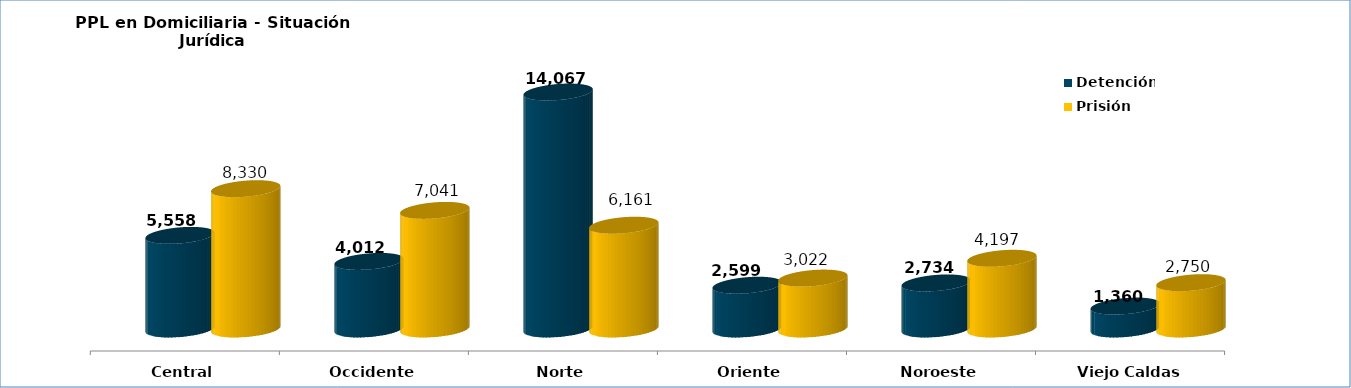
| Category | Detención | Prisión |
|---|---|---|
| Central | 5558 | 8330 |
| Occidente | 4012 | 7041 |
| Norte | 14067 | 6161 |
| Oriente | 2599 | 3022 |
| Noroeste | 2734 | 4197 |
| Viejo Caldas | 1360 | 2750 |